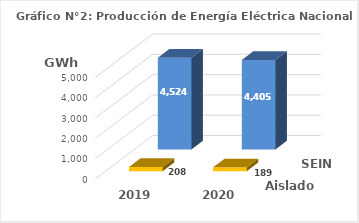
| Category | Aislados | SEIN |
|---|---|---|
| 2019.0 | 208.141 | 4523.902 |
| 2020.0 | 189.457 | 4405.241 |